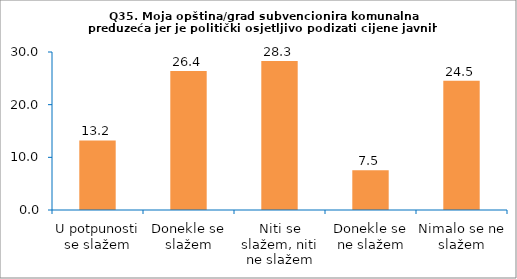
| Category | Series 0 |
|---|---|
| U potpunosti se slažem | 13.208 |
| Donekle se slažem | 26.415 |
| Niti se slažem, niti ne slažem | 28.302 |
| Donekle se ne slažem | 7.547 |
| Nimalo se ne slažem | 24.528 |